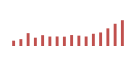
| Category | Importações (2) |
|---|---|
| 0 | 575.605 |
| 1 | 741.035 |
| 2 | 1388.881 |
| 3 | 899.436 |
| 4 | 1170.349 |
| 5 | 1022.737 |
| 6 | 1030.066 |
| 7 | 1010.02 |
| 8 | 1183.202 |
| 9 | 1121.55 |
| 10 | 1027.2 |
| 11 | 1322.664 |
| 12 | 1463.875 |
| 13 | 1908.09 |
| 14 | 2403.679 |
| 15 | 2787.649 |